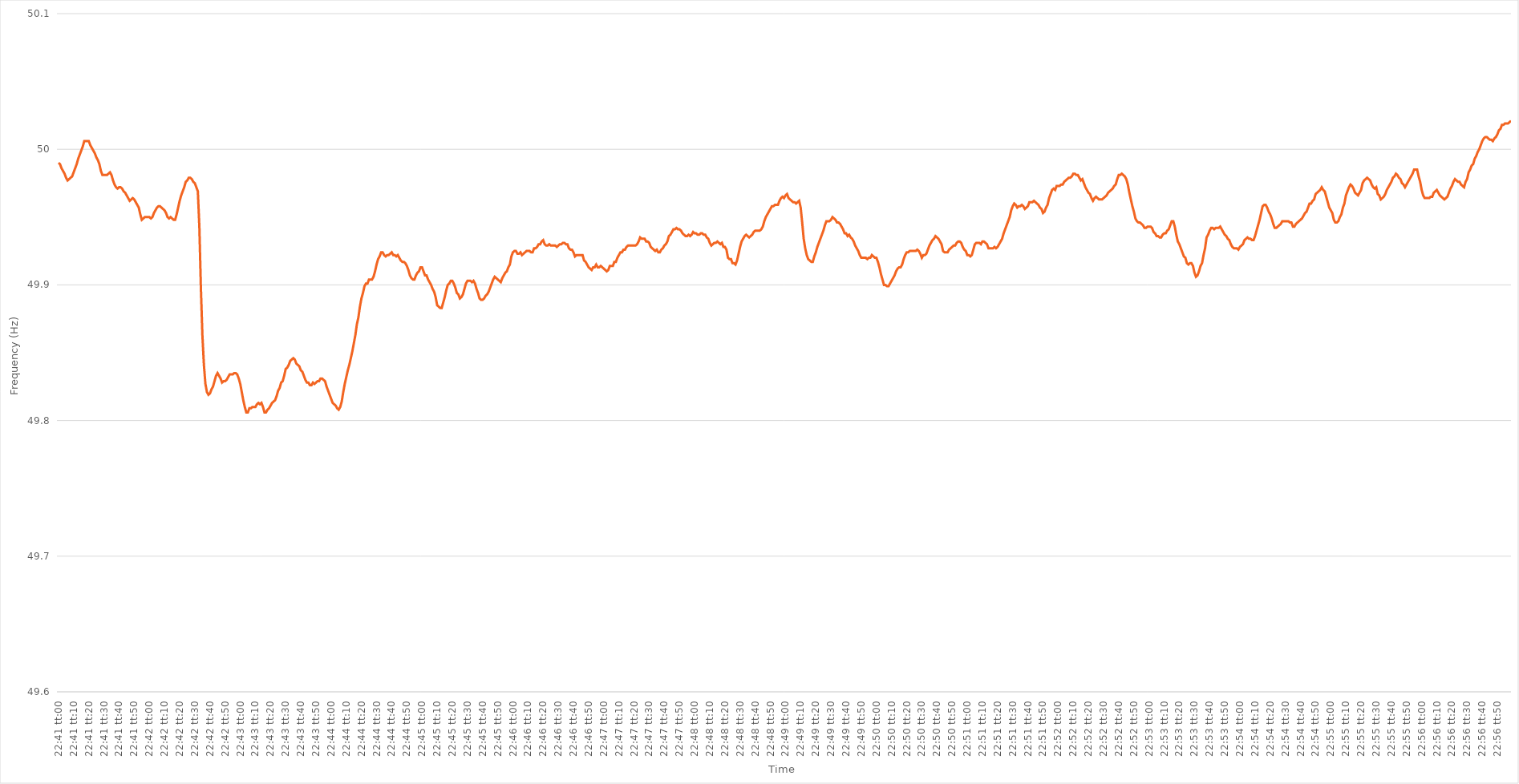
| Category | Series 0 |
|---|---|
| 0.9451388888888889 | 49.99 |
| 0.945150462962963 | 49.989 |
| 0.9451620370370369 | 49.986 |
| 0.9451736111111111 | 49.984 |
| 0.9451851851851852 | 49.982 |
| 0.9451967592592593 | 49.979 |
| 0.9452083333333333 | 49.977 |
| 0.9452199074074074 | 49.978 |
| 0.9452314814814815 | 49.979 |
| 0.9452430555555557 | 49.98 |
| 0.9452546296296296 | 49.983 |
| 0.9452662037037037 | 49.986 |
| 0.9452777777777778 | 49.989 |
| 0.9452893518518519 | 49.993 |
| 0.9453009259259259 | 49.996 |
| 0.9453125 | 49.999 |
| 0.9453240740740741 | 50.002 |
| 0.9453356481481481 | 50.006 |
| 0.9453472222222222 | 50.006 |
| 0.9453587962962963 | 50.006 |
| 0.9453703703703704 | 50.006 |
| 0.9453819444444443 | 50.003 |
| 0.9453935185185185 | 50.001 |
| 0.9454050925925926 | 49.999 |
| 0.9454166666666667 | 49.997 |
| 0.9454282407407407 | 49.994 |
| 0.9454398148148148 | 49.992 |
| 0.9454513888888889 | 49.989 |
| 0.9454629629629631 | 49.984 |
| 0.945474537037037 | 49.981 |
| 0.9454861111111111 | 49.981 |
| 0.9454976851851852 | 49.981 |
| 0.9455092592592593 | 49.981 |
| 0.9455208333333333 | 49.982 |
| 0.9455324074074074 | 49.983 |
| 0.9455439814814816 | 49.981 |
| 0.9455555555555556 | 49.977 |
| 0.9455671296296296 | 49.974 |
| 0.9455787037037037 | 49.972 |
| 0.9455902777777778 | 49.971 |
| 0.9456018518518517 | 49.972 |
| 0.9456134259259259 | 49.972 |
| 0.945625 | 49.971 |
| 0.9456365740740741 | 49.969 |
| 0.9456481481481481 | 49.968 |
| 0.9456597222222222 | 49.966 |
| 0.9456712962962963 | 49.964 |
| 0.9456828703703705 | 49.962 |
| 0.9456944444444444 | 49.963 |
| 0.9457060185185185 | 49.964 |
| 0.9457175925925926 | 49.963 |
| 0.9457291666666667 | 49.961 |
| 0.9457407407407407 | 49.959 |
| 0.9457523148148148 | 49.957 |
| 0.945763888888889 | 49.952 |
| 0.945775462962963 | 49.948 |
| 0.945787037037037 | 49.949 |
| 0.9457986111111111 | 49.95 |
| 0.9458101851851852 | 49.95 |
| 0.9458217592592592 | 49.95 |
| 0.9458333333333333 | 49.95 |
| 0.9458449074074075 | 49.949 |
| 0.9458564814814815 | 49.95 |
| 0.9458680555555555 | 49.953 |
| 0.9458796296296296 | 49.955 |
| 0.9458912037037037 | 49.957 |
| 0.9459027777777779 | 49.958 |
| 0.9459143518518518 | 49.958 |
| 0.945925925925926 | 49.957 |
| 0.9459375 | 49.956 |
| 0.9459490740740741 | 49.955 |
| 0.9459606481481481 | 49.953 |
| 0.9459722222222222 | 49.95 |
| 0.9459837962962964 | 49.949 |
| 0.9459953703703704 | 49.95 |
| 0.9460069444444444 | 49.949 |
| 0.9460185185185185 | 49.948 |
| 0.9460300925925926 | 49.948 |
| 0.9460416666666666 | 49.952 |
| 0.9460532407407407 | 49.957 |
| 0.9460648148148149 | 49.962 |
| 0.9460763888888889 | 49.966 |
| 0.9460879629629629 | 49.969 |
| 0.946099537037037 | 49.972 |
| 0.9461111111111111 | 49.976 |
| 0.9461226851851853 | 49.977 |
| 0.9461342592592592 | 49.979 |
| 0.9461458333333334 | 49.979 |
| 0.9461574074074074 | 49.978 |
| 0.9461689814814815 | 49.976 |
| 0.9461805555555555 | 49.975 |
| 0.9461921296296296 | 49.972 |
| 0.9462037037037038 | 49.969 |
| 0.9462152777777778 | 49.943 |
| 0.9462268518518518 | 49.898 |
| 0.9462384259259259 | 49.863 |
| 0.94625 | 49.841 |
| 0.946261574074074 | 49.827 |
| 0.9462731481481481 | 49.821 |
| 0.9462847222222223 | 49.819 |
| 0.9462962962962963 | 49.82 |
| 0.9463078703703703 | 49.823 |
| 0.9463194444444444 | 49.825 |
| 0.9463310185185185 | 49.829 |
| 0.9463425925925927 | 49.833 |
| 0.9463541666666666 | 49.835 |
| 0.9463657407407408 | 49.833 |
| 0.9463773148148148 | 49.831 |
| 0.946388888888889 | 49.828 |
| 0.9464004629629629 | 49.829 |
| 0.946412037037037 | 49.829 |
| 0.9464236111111112 | 49.83 |
| 0.9464351851851852 | 49.832 |
| 0.9464467592592593 | 49.834 |
| 0.9464583333333333 | 49.834 |
| 0.9464699074074074 | 49.834 |
| 0.9464814814814814 | 49.835 |
| 0.9464930555555555 | 49.835 |
| 0.9465046296296297 | 49.834 |
| 0.9465162037037037 | 49.831 |
| 0.9465277777777777 | 49.827 |
| 0.9465393518518518 | 49.821 |
| 0.9465509259259259 | 49.815 |
| 0.9465625000000001 | 49.81 |
| 0.946574074074074 | 49.806 |
| 0.9465856481481482 | 49.806 |
| 0.9465972222222222 | 49.809 |
| 0.9466087962962964 | 49.809 |
| 0.9466203703703703 | 49.81 |
| 0.9466319444444444 | 49.81 |
| 0.9466435185185186 | 49.81 |
| 0.9466550925925926 | 49.812 |
| 0.9466666666666667 | 49.813 |
| 0.9466782407407407 | 49.812 |
| 0.9466898148148148 | 49.813 |
| 0.946701388888889 | 49.81 |
| 0.9467129629629629 | 49.806 |
| 0.9467245370370371 | 49.806 |
| 0.9467361111111111 | 49.808 |
| 0.9467476851851853 | 49.809 |
| 0.9467592592592592 | 49.811 |
| 0.9467708333333333 | 49.813 |
| 0.9467824074074075 | 49.814 |
| 0.9467939814814814 | 49.815 |
| 0.9468055555555556 | 49.818 |
| 0.9468171296296296 | 49.822 |
| 0.9468287037037038 | 49.824 |
| 0.9468402777777777 | 49.828 |
| 0.9468518518518518 | 49.829 |
| 0.946863425925926 | 49.833 |
| 0.946875 | 49.838 |
| 0.9468865740740741 | 49.839 |
| 0.9468981481481481 | 49.841 |
| 0.9469097222222222 | 49.844 |
| 0.9469212962962964 | 49.845 |
| 0.9469328703703703 | 49.846 |
| 0.9469444444444445 | 49.845 |
| 0.9469560185185185 | 49.842 |
| 0.9469675925925927 | 49.841 |
| 0.9469791666666666 | 49.84 |
| 0.9469907407407407 | 49.837 |
| 0.9470023148148149 | 49.836 |
| 0.9470138888888888 | 49.833 |
| 0.947025462962963 | 49.83 |
| 0.947037037037037 | 49.828 |
| 0.9470486111111112 | 49.828 |
| 0.9470601851851851 | 49.826 |
| 0.9470717592592592 | 49.826 |
| 0.9470833333333334 | 49.828 |
| 0.9470949074074074 | 49.827 |
| 0.9471064814814815 | 49.828 |
| 0.9471180555555555 | 49.829 |
| 0.9471296296296297 | 49.829 |
| 0.9471412037037038 | 49.831 |
| 0.9471527777777777 | 49.831 |
| 0.9471643518518519 | 49.83 |
| 0.9471759259259259 | 49.829 |
| 0.9471875000000001 | 49.825 |
| 0.947199074074074 | 49.822 |
| 0.9472106481481481 | 49.819 |
| 0.9472222222222223 | 49.816 |
| 0.9472337962962962 | 49.813 |
| 0.9472453703703704 | 49.812 |
| 0.9472569444444444 | 49.811 |
| 0.9472685185185186 | 49.809 |
| 0.9472800925925925 | 49.808 |
| 0.9472916666666666 | 49.81 |
| 0.9473032407407408 | 49.814 |
| 0.9473148148148148 | 49.821 |
| 0.9473263888888889 | 49.827 |
| 0.9473379629629629 | 49.832 |
| 0.9473495370370371 | 49.837 |
| 0.9473611111111112 | 49.841 |
| 0.9473726851851851 | 49.846 |
| 0.9473842592592593 | 49.851 |
| 0.9473958333333333 | 49.857 |
| 0.9474074074074075 | 49.863 |
| 0.9474189814814814 | 49.871 |
| 0.9474305555555556 | 49.876 |
| 0.9474421296296297 | 49.884 |
| 0.9474537037037036 | 49.89 |
| 0.9474652777777778 | 49.894 |
| 0.9474768518518518 | 49.899 |
| 0.947488425925926 | 49.901 |
| 0.9474999999999999 | 49.901 |
| 0.947511574074074 | 49.904 |
| 0.9475231481481482 | 49.904 |
| 0.9475347222222222 | 49.904 |
| 0.9475462962962963 | 49.906 |
| 0.9475578703703703 | 49.91 |
| 0.9475694444444445 | 49.915 |
| 0.9475810185185186 | 49.919 |
| 0.9475925925925925 | 49.921 |
| 0.9476041666666667 | 49.924 |
| 0.9476157407407407 | 49.924 |
| 0.9476273148148149 | 49.922 |
| 0.9476388888888888 | 49.921 |
| 0.947650462962963 | 49.922 |
| 0.9476620370370371 | 49.922 |
| 0.947673611111111 | 49.923 |
| 0.9476851851851852 | 49.924 |
| 0.9476967592592592 | 49.922 |
| 0.9477083333333334 | 49.922 |
| 0.9477199074074073 | 49.921 |
| 0.9477314814814815 | 49.922 |
| 0.9477430555555556 | 49.92 |
| 0.9477546296296296 | 49.918 |
| 0.9477662037037037 | 49.917 |
| 0.9477777777777777 | 49.917 |
| 0.9477893518518519 | 49.916 |
| 0.947800925925926 | 49.914 |
| 0.9478125 | 49.911 |
| 0.9478240740740741 | 49.907 |
| 0.9478356481481481 | 49.905 |
| 0.9478472222222223 | 49.904 |
| 0.9478587962962962 | 49.904 |
| 0.9478703703703704 | 49.907 |
| 0.9478819444444445 | 49.909 |
| 0.9478935185185186 | 49.91 |
| 0.9479050925925926 | 49.913 |
| 0.9479166666666666 | 49.913 |
| 0.9479282407407408 | 49.91 |
| 0.9479398148148147 | 49.907 |
| 0.9479513888888889 | 49.907 |
| 0.947962962962963 | 49.904 |
| 0.947974537037037 | 49.902 |
| 0.9479861111111111 | 49.9 |
| 0.9479976851851851 | 49.897 |
| 0.9480092592592593 | 49.895 |
| 0.9480208333333334 | 49.891 |
| 0.9480324074074074 | 49.885 |
| 0.9480439814814815 | 49.884 |
| 0.9480555555555555 | 49.883 |
| 0.9480671296296297 | 49.883 |
| 0.9480787037037036 | 49.887 |
| 0.9480902777777778 | 49.891 |
| 0.9481018518518519 | 49.896 |
| 0.948113425925926 | 49.9 |
| 0.948125 | 49.901 |
| 0.948136574074074 | 49.903 |
| 0.9481481481481482 | 49.903 |
| 0.9481597222222223 | 49.901 |
| 0.9481712962962963 | 49.898 |
| 0.9481828703703704 | 49.894 |
| 0.9481944444444445 | 49.893 |
| 0.9482060185185185 | 49.89 |
| 0.9482175925925925 | 49.891 |
| 0.9482291666666667 | 49.893 |
| 0.9482407407407408 | 49.897 |
| 0.9482523148148148 | 49.901 |
| 0.9482638888888889 | 49.903 |
| 0.948275462962963 | 49.903 |
| 0.9482870370370371 | 49.903 |
| 0.948298611111111 | 49.902 |
| 0.9483101851851852 | 49.903 |
| 0.9483217592592593 | 49.901 |
| 0.9483333333333334 | 49.897 |
| 0.9483449074074074 | 49.894 |
| 0.9483564814814814 | 49.89 |
| 0.9483680555555556 | 49.889 |
| 0.9483796296296297 | 49.889 |
| 0.9483912037037037 | 49.89 |
| 0.9484027777777778 | 49.892 |
| 0.9484143518518519 | 49.893 |
| 0.9484259259259259 | 49.895 |
| 0.9484374999999999 | 49.898 |
| 0.9484490740740741 | 49.901 |
| 0.9484606481481482 | 49.904 |
| 0.9484722222222222 | 49.906 |
| 0.9484837962962963 | 49.905 |
| 0.9484953703703703 | 49.904 |
| 0.9485069444444445 | 49.903 |
| 0.9485185185185184 | 49.902 |
| 0.9485300925925926 | 49.905 |
| 0.9485416666666667 | 49.907 |
| 0.9485532407407408 | 49.909 |
| 0.9485648148148148 | 49.91 |
| 0.9485763888888888 | 49.913 |
| 0.948587962962963 | 49.915 |
| 0.9485995370370371 | 49.921 |
| 0.9486111111111111 | 49.924 |
| 0.9486226851851852 | 49.925 |
| 0.9486342592592593 | 49.925 |
| 0.9486458333333333 | 49.923 |
| 0.9486574074074073 | 49.923 |
| 0.9486689814814815 | 49.924 |
| 0.9486805555555556 | 49.922 |
| 0.9486921296296296 | 49.923 |
| 0.9487037037037037 | 49.924 |
| 0.9487152777777778 | 49.925 |
| 0.9487268518518519 | 49.925 |
| 0.9487384259259258 | 49.925 |
| 0.94875 | 49.924 |
| 0.9487615740740741 | 49.924 |
| 0.9487731481481482 | 49.927 |
| 0.9487847222222222 | 49.927 |
| 0.9487962962962962 | 49.928 |
| 0.9488078703703704 | 49.93 |
| 0.9488194444444445 | 49.93 |
| 0.9488310185185185 | 49.932 |
| 0.9488425925925926 | 49.933 |
| 0.9488541666666667 | 49.93 |
| 0.9488657407407407 | 49.929 |
| 0.9488773148148147 | 49.929 |
| 0.9488888888888889 | 49.93 |
| 0.948900462962963 | 49.929 |
| 0.948912037037037 | 49.929 |
| 0.9489236111111111 | 49.929 |
| 0.9489351851851852 | 49.929 |
| 0.9489467592592593 | 49.928 |
| 0.9489583333333332 | 49.929 |
| 0.9489699074074074 | 49.93 |
| 0.9489814814814815 | 49.93 |
| 0.9489930555555556 | 49.931 |
| 0.9490046296296296 | 49.931 |
| 0.9490162037037037 | 49.93 |
| 0.9490277777777778 | 49.93 |
| 0.949039351851852 | 49.927 |
| 0.9490509259259259 | 49.926 |
| 0.9490625 | 49.926 |
| 0.9490740740740741 | 49.924 |
| 0.9490856481481481 | 49.921 |
| 0.9490972222222221 | 49.922 |
| 0.9491087962962963 | 49.922 |
| 0.9491203703703704 | 49.922 |
| 0.9491319444444444 | 49.922 |
| 0.9491435185185185 | 49.922 |
| 0.9491550925925926 | 49.918 |
| 0.9491666666666667 | 49.917 |
| 0.9491782407407406 | 49.915 |
| 0.9491898148148148 | 49.913 |
| 0.9492013888888889 | 49.912 |
| 0.949212962962963 | 49.911 |
| 0.949224537037037 | 49.913 |
| 0.9492361111111111 | 49.913 |
| 0.9492476851851852 | 49.915 |
| 0.9492592592592594 | 49.913 |
| 0.9492708333333333 | 49.913 |
| 0.9492824074074074 | 49.914 |
| 0.9492939814814815 | 49.913 |
| 0.9493055555555556 | 49.912 |
| 0.9493171296296296 | 49.911 |
| 0.9493287037037037 | 49.91 |
| 0.9493402777777779 | 49.911 |
| 0.9493518518518519 | 49.914 |
| 0.9493634259259259 | 49.914 |
| 0.949375 | 49.914 |
| 0.9493865740740741 | 49.917 |
| 0.949398148148148 | 49.917 |
| 0.9494097222222222 | 49.92 |
| 0.9494212962962963 | 49.922 |
| 0.9494328703703704 | 49.924 |
| 0.9494444444444444 | 49.924 |
| 0.9494560185185185 | 49.926 |
| 0.9494675925925926 | 49.926 |
| 0.9494791666666668 | 49.928 |
| 0.9494907407407407 | 49.929 |
| 0.9495023148148148 | 49.929 |
| 0.9495138888888889 | 49.929 |
| 0.949525462962963 | 49.929 |
| 0.949537037037037 | 49.929 |
| 0.9495486111111111 | 49.929 |
| 0.9495601851851853 | 49.93 |
| 0.9495717592592593 | 49.932 |
| 0.9495833333333333 | 49.935 |
| 0.9495949074074074 | 49.934 |
| 0.9496064814814815 | 49.934 |
| 0.9496180555555555 | 49.934 |
| 0.9496296296296296 | 49.932 |
| 0.9496412037037038 | 49.932 |
| 0.9496527777777778 | 49.931 |
| 0.9496643518518518 | 49.928 |
| 0.9496759259259259 | 49.927 |
| 0.9496875 | 49.926 |
| 0.9496990740740742 | 49.925 |
| 0.9497106481481481 | 49.926 |
| 0.9497222222222222 | 49.924 |
| 0.9497337962962963 | 49.924 |
| 0.9497453703703704 | 49.926 |
| 0.9497569444444444 | 49.927 |
| 0.9497685185185185 | 49.929 |
| 0.9497800925925927 | 49.93 |
| 0.9497916666666667 | 49.932 |
| 0.9498032407407407 | 49.936 |
| 0.9498148148148148 | 49.937 |
| 0.9498263888888889 | 49.939 |
| 0.9498379629629629 | 49.941 |
| 0.949849537037037 | 49.941 |
| 0.9498611111111112 | 49.942 |
| 0.9498726851851852 | 49.941 |
| 0.9498842592592592 | 49.941 |
| 0.9498958333333333 | 49.94 |
| 0.9499074074074074 | 49.938 |
| 0.9499189814814816 | 49.937 |
| 0.9499305555555555 | 49.936 |
| 0.9499421296296297 | 49.936 |
| 0.9499537037037037 | 49.937 |
| 0.9499652777777778 | 49.936 |
| 0.9499768518518518 | 49.937 |
| 0.9499884259259259 | 49.939 |
| 0.9500000000000001 | 49.938 |
| 0.9500115740740741 | 49.938 |
| 0.9500231481481481 | 49.937 |
| 0.9500347222222222 | 49.937 |
| 0.9500462962962963 | 49.938 |
| 0.9500578703703703 | 49.938 |
| 0.9500694444444444 | 49.937 |
| 0.9500810185185186 | 49.937 |
| 0.9500925925925926 | 49.935 |
| 0.9501041666666666 | 49.934 |
| 0.9501157407407407 | 49.931 |
| 0.9501273148148148 | 49.929 |
| 0.950138888888889 | 49.93 |
| 0.9501504629629629 | 49.931 |
| 0.950162037037037 | 49.931 |
| 0.9501736111111111 | 49.932 |
| 0.9501851851851852 | 49.931 |
| 0.9501967592592592 | 49.93 |
| 0.9502083333333333 | 49.931 |
| 0.9502199074074075 | 49.928 |
| 0.9502314814814815 | 49.928 |
| 0.9502430555555555 | 49.926 |
| 0.9502546296296296 | 49.92 |
| 0.9502662037037037 | 49.919 |
| 0.9502777777777777 | 49.919 |
| 0.9502893518518518 | 49.916 |
| 0.950300925925926 | 49.916 |
| 0.9503125 | 49.915 |
| 0.950324074074074 | 49.918 |
| 0.9503356481481481 | 49.923 |
| 0.9503472222222222 | 49.928 |
| 0.9503587962962964 | 49.932 |
| 0.9503703703703703 | 49.934 |
| 0.9503819444444445 | 49.936 |
| 0.9503935185185185 | 49.937 |
| 0.9504050925925926 | 49.936 |
| 0.9504166666666666 | 49.935 |
| 0.9504282407407407 | 49.936 |
| 0.9504398148148149 | 49.937 |
| 0.9504513888888889 | 49.939 |
| 0.950462962962963 | 49.94 |
| 0.950474537037037 | 49.94 |
| 0.9504861111111111 | 49.94 |
| 0.9504976851851853 | 49.94 |
| 0.9505092592592592 | 49.941 |
| 0.9505208333333334 | 49.943 |
| 0.9505324074074074 | 49.947 |
| 0.9505439814814814 | 49.95 |
| 0.9505555555555555 | 49.952 |
| 0.9505671296296296 | 49.954 |
| 0.9505787037037038 | 49.956 |
| 0.9505902777777777 | 49.958 |
| 0.9506018518518519 | 49.958 |
| 0.9506134259259259 | 49.959 |
| 0.950625 | 49.959 |
| 0.950636574074074 | 49.959 |
| 0.9506481481481481 | 49.962 |
| 0.9506597222222223 | 49.964 |
| 0.9506712962962963 | 49.965 |
| 0.9506828703703704 | 49.964 |
| 0.9506944444444444 | 49.966 |
| 0.9507060185185185 | 49.967 |
| 0.9507175925925927 | 49.964 |
| 0.9507291666666666 | 49.963 |
| 0.9507407407407408 | 49.962 |
| 0.9507523148148148 | 49.961 |
| 0.950763888888889 | 49.961 |
| 0.9507754629629629 | 49.96 |
| 0.950787037037037 | 49.961 |
| 0.9507986111111112 | 49.962 |
| 0.9508101851851851 | 49.957 |
| 0.9508217592592593 | 49.946 |
| 0.9508333333333333 | 49.934 |
| 0.9508449074074075 | 49.927 |
| 0.9508564814814814 | 49.922 |
| 0.9508680555555555 | 49.919 |
| 0.9508796296296297 | 49.918 |
| 0.9508912037037037 | 49.917 |
| 0.9509027777777778 | 49.917 |
| 0.9509143518518518 | 49.921 |
| 0.950925925925926 | 49.924 |
| 0.9509375000000001 | 49.928 |
| 0.950949074074074 | 49.931 |
| 0.9509606481481482 | 49.934 |
| 0.9509722222222222 | 49.937 |
| 0.9509837962962964 | 49.94 |
| 0.9509953703703703 | 49.944 |
| 0.9510069444444444 | 49.947 |
| 0.9510185185185186 | 49.947 |
| 0.9510300925925925 | 49.947 |
| 0.9510416666666667 | 49.948 |
| 0.9510532407407407 | 49.95 |
| 0.9510648148148149 | 49.949 |
| 0.9510763888888888 | 49.948 |
| 0.9510879629629629 | 49.946 |
| 0.9510995370370371 | 49.946 |
| 0.9511111111111111 | 49.945 |
| 0.9511226851851852 | 49.943 |
| 0.9511342592592592 | 49.941 |
| 0.9511458333333334 | 49.938 |
| 0.9511574074074075 | 49.938 |
| 0.9511689814814814 | 49.936 |
| 0.9511805555555556 | 49.937 |
| 0.9511921296296296 | 49.935 |
| 0.9512037037037038 | 49.934 |
| 0.9512152777777777 | 49.932 |
| 0.9512268518518519 | 49.929 |
| 0.951238425925926 | 49.927 |
| 0.9512499999999999 | 49.925 |
| 0.9512615740740741 | 49.922 |
| 0.9512731481481481 | 49.92 |
| 0.9512847222222223 | 49.92 |
| 0.9512962962962962 | 49.92 |
| 0.9513078703703703 | 49.92 |
| 0.9513194444444445 | 49.919 |
| 0.9513310185185185 | 49.92 |
| 0.9513425925925926 | 49.92 |
| 0.9513541666666666 | 49.922 |
| 0.9513657407407408 | 49.921 |
| 0.9513773148148149 | 49.92 |
| 0.9513888888888888 | 49.92 |
| 0.951400462962963 | 49.917 |
| 0.951412037037037 | 49.913 |
| 0.9514236111111112 | 49.908 |
| 0.9514351851851851 | 49.904 |
| 0.9514467592592593 | 49.9 |
| 0.9514583333333334 | 49.9 |
| 0.9514699074074073 | 49.899 |
| 0.9514814814814815 | 49.899 |
| 0.9514930555555555 | 49.901 |
| 0.9515046296296297 | 49.903 |
| 0.9515162037037036 | 49.905 |
| 0.9515277777777778 | 49.907 |
| 0.9515393518518519 | 49.91 |
| 0.9515509259259259 | 49.912 |
| 0.9515625 | 49.913 |
| 0.951574074074074 | 49.913 |
| 0.9515856481481482 | 49.915 |
| 0.9515972222222223 | 49.919 |
| 0.9516087962962962 | 49.922 |
| 0.9516203703703704 | 49.924 |
| 0.9516319444444444 | 49.924 |
| 0.9516435185185186 | 49.925 |
| 0.9516550925925925 | 49.925 |
| 0.9516666666666667 | 49.925 |
| 0.9516782407407408 | 49.925 |
| 0.9516898148148147 | 49.925 |
| 0.9517013888888889 | 49.926 |
| 0.9517129629629629 | 49.925 |
| 0.9517245370370371 | 49.923 |
| 0.951736111111111 | 49.92 |
| 0.9517476851851852 | 49.922 |
| 0.9517592592592593 | 49.922 |
| 0.9517708333333333 | 49.923 |
| 0.9517824074074074 | 49.926 |
| 0.9517939814814814 | 49.929 |
| 0.9518055555555556 | 49.931 |
| 0.9518171296296297 | 49.933 |
| 0.9518287037037036 | 49.934 |
| 0.9518402777777778 | 49.936 |
| 0.9518518518518518 | 49.935 |
| 0.951863425925926 | 49.934 |
| 0.9518749999999999 | 49.932 |
| 0.9518865740740741 | 49.93 |
| 0.9518981481481482 | 49.925 |
| 0.9519097222222223 | 49.924 |
| 0.9519212962962963 | 49.924 |
| 0.9519328703703703 | 49.924 |
| 0.9519444444444445 | 49.926 |
| 0.9519560185185186 | 49.927 |
| 0.9519675925925926 | 49.928 |
| 0.9519791666666667 | 49.929 |
| 0.9519907407407407 | 49.929 |
| 0.9520023148148148 | 49.931 |
| 0.9520138888888888 | 49.932 |
| 0.952025462962963 | 49.932 |
| 0.9520370370370371 | 49.931 |
| 0.952048611111111 | 49.928 |
| 0.9520601851851852 | 49.926 |
| 0.9520717592592592 | 49.925 |
| 0.9520833333333334 | 49.922 |
| 0.9520949074074073 | 49.922 |
| 0.9521064814814815 | 49.921 |
| 0.9521180555555556 | 49.922 |
| 0.9521296296296297 | 49.926 |
| 0.9521412037037037 | 49.93 |
| 0.9521527777777777 | 49.931 |
| 0.9521643518518519 | 49.931 |
| 0.952175925925926 | 49.931 |
| 0.9521875 | 49.93 |
| 0.9521990740740741 | 49.932 |
| 0.9522106481481482 | 49.932 |
| 0.9522222222222222 | 49.931 |
| 0.9522337962962962 | 49.93 |
| 0.9522453703703704 | 49.927 |
| 0.9522569444444445 | 49.927 |
| 0.9522685185185185 | 49.927 |
| 0.9522800925925926 | 49.927 |
| 0.9522916666666666 | 49.928 |
| 0.9523032407407408 | 49.927 |
| 0.9523148148148147 | 49.928 |
| 0.9523263888888889 | 49.93 |
| 0.952337962962963 | 49.932 |
| 0.9523495370370371 | 49.934 |
| 0.9523611111111111 | 49.938 |
| 0.9523726851851851 | 49.941 |
| 0.9523842592592593 | 49.944 |
| 0.9523958333333334 | 49.947 |
| 0.9524074074074074 | 49.95 |
| 0.9524189814814815 | 49.955 |
| 0.9524305555555556 | 49.958 |
| 0.9524421296296296 | 49.96 |
| 0.9524537037037036 | 49.959 |
| 0.9524652777777778 | 49.957 |
| 0.9524768518518519 | 49.958 |
| 0.9524884259259259 | 49.958 |
| 0.9525 | 49.959 |
| 0.952511574074074 | 49.958 |
| 0.9525231481481482 | 49.956 |
| 0.9525347222222221 | 49.957 |
| 0.9525462962962963 | 49.958 |
| 0.9525578703703704 | 49.961 |
| 0.9525694444444445 | 49.961 |
| 0.9525810185185185 | 49.961 |
| 0.9525925925925925 | 49.962 |
| 0.9526041666666667 | 49.961 |
| 0.9526157407407408 | 49.96 |
| 0.9526273148148148 | 49.959 |
| 0.9526388888888889 | 49.957 |
| 0.952650462962963 | 49.956 |
| 0.952662037037037 | 49.953 |
| 0.952673611111111 | 49.954 |
| 0.9526851851851852 | 49.957 |
| 0.9526967592592593 | 49.959 |
| 0.9527083333333333 | 49.964 |
| 0.9527199074074074 | 49.967 |
| 0.9527314814814815 | 49.97 |
| 0.9527430555555556 | 49.971 |
| 0.9527546296296295 | 49.97 |
| 0.9527662037037037 | 49.973 |
| 0.9527777777777778 | 49.973 |
| 0.9527893518518519 | 49.973 |
| 0.9528009259259259 | 49.974 |
| 0.9528125 | 49.974 |
| 0.9528240740740741 | 49.976 |
| 0.9528356481481483 | 49.977 |
| 0.9528472222222222 | 49.978 |
| 0.9528587962962963 | 49.979 |
| 0.9528703703703704 | 49.979 |
| 0.9528819444444444 | 49.98 |
| 0.9528935185185184 | 49.982 |
| 0.9529050925925926 | 49.982 |
| 0.9529166666666667 | 49.981 |
| 0.9529282407407407 | 49.981 |
| 0.9529398148148148 | 49.979 |
| 0.9529513888888889 | 49.977 |
| 0.952962962962963 | 49.978 |
| 0.9529745370370369 | 49.975 |
| 0.9529861111111111 | 49.972 |
| 0.9529976851851852 | 49.97 |
| 0.9530092592592593 | 49.968 |
| 0.9530208333333333 | 49.967 |
| 0.9530324074074074 | 49.964 |
| 0.9530439814814815 | 49.962 |
| 0.9530555555555557 | 49.964 |
| 0.9530671296296296 | 49.965 |
| 0.9530787037037037 | 49.964 |
| 0.9530902777777778 | 49.963 |
| 0.9531018518518519 | 49.963 |
| 0.9531134259259259 | 49.963 |
| 0.953125 | 49.964 |
| 0.9531365740740741 | 49.965 |
| 0.9531481481481481 | 49.966 |
| 0.9531597222222222 | 49.968 |
| 0.9531712962962963 | 49.969 |
| 0.9531828703703704 | 49.97 |
| 0.9531944444444443 | 49.971 |
| 0.9532060185185185 | 49.973 |
| 0.9532175925925926 | 49.974 |
| 0.9532291666666667 | 49.978 |
| 0.9532407407407407 | 49.981 |
| 0.9532523148148148 | 49.981 |
| 0.9532638888888889 | 49.982 |
| 0.9532754629629631 | 49.981 |
| 0.953287037037037 | 49.98 |
| 0.9532986111111111 | 49.978 |
| 0.9533101851851852 | 49.974 |
| 0.9533217592592593 | 49.968 |
| 0.9533333333333333 | 49.963 |
| 0.9533449074074074 | 49.958 |
| 0.9533564814814816 | 49.954 |
| 0.9533680555555556 | 49.949 |
| 0.9533796296296296 | 49.947 |
| 0.9533912037037037 | 49.946 |
| 0.9534027777777778 | 49.946 |
| 0.9534143518518517 | 49.945 |
| 0.9534259259259259 | 49.944 |
| 0.9534375 | 49.942 |
| 0.9534490740740741 | 49.942 |
| 0.9534606481481481 | 49.943 |
| 0.9534722222222222 | 49.943 |
| 0.9534837962962963 | 49.943 |
| 0.9534953703703705 | 49.942 |
| 0.9535069444444444 | 49.939 |
| 0.9535185185185185 | 49.938 |
| 0.9535300925925926 | 49.936 |
| 0.9535416666666667 | 49.936 |
| 0.9535532407407407 | 49.935 |
| 0.9535648148148148 | 49.935 |
| 0.953576388888889 | 49.937 |
| 0.953587962962963 | 49.938 |
| 0.953599537037037 | 49.938 |
| 0.9536111111111111 | 49.94 |
| 0.9536226851851852 | 49.941 |
| 0.9536342592592592 | 49.944 |
| 0.9536458333333333 | 49.947 |
| 0.9536574074074075 | 49.947 |
| 0.9536689814814815 | 49.943 |
| 0.9536805555555555 | 49.937 |
| 0.9536921296296296 | 49.932 |
| 0.9537037037037037 | 49.93 |
| 0.9537152777777779 | 49.927 |
| 0.9537268518518518 | 49.924 |
| 0.953738425925926 | 49.921 |
| 0.95375 | 49.92 |
| 0.9537615740740741 | 49.916 |
| 0.9537731481481481 | 49.915 |
| 0.9537847222222222 | 49.916 |
| 0.9537962962962964 | 49.916 |
| 0.9538078703703704 | 49.914 |
| 0.9538194444444444 | 49.909 |
| 0.9538310185185185 | 49.906 |
| 0.9538425925925926 | 49.907 |
| 0.9538541666666666 | 49.91 |
| 0.9538657407407407 | 49.914 |
| 0.9538773148148149 | 49.916 |
| 0.9538888888888889 | 49.922 |
| 0.9539004629629629 | 49.927 |
| 0.953912037037037 | 49.935 |
| 0.9539236111111111 | 49.937 |
| 0.9539351851851853 | 49.94 |
| 0.9539467592592592 | 49.942 |
| 0.9539583333333334 | 49.942 |
| 0.9539699074074074 | 49.941 |
| 0.9539814814814815 | 49.942 |
| 0.9539930555555555 | 49.942 |
| 0.9540046296296296 | 49.942 |
| 0.9540162037037038 | 49.943 |
| 0.9540277777777778 | 49.941 |
| 0.9540393518518518 | 49.939 |
| 0.9540509259259259 | 49.937 |
| 0.9540625 | 49.936 |
| 0.954074074074074 | 49.934 |
| 0.9540856481481481 | 49.933 |
| 0.9540972222222223 | 49.93 |
| 0.9541087962962963 | 49.928 |
| 0.9541203703703703 | 49.927 |
| 0.9541319444444444 | 49.927 |
| 0.9541435185185185 | 49.927 |
| 0.9541550925925927 | 49.926 |
| 0.9541666666666666 | 49.928 |
| 0.9541782407407408 | 49.929 |
| 0.9541898148148148 | 49.93 |
| 0.954201388888889 | 49.933 |
| 0.9542129629629629 | 49.934 |
| 0.954224537037037 | 49.935 |
| 0.9542361111111112 | 49.934 |
| 0.9542476851851852 | 49.934 |
| 0.9542592592592593 | 49.933 |
| 0.9542708333333333 | 49.933 |
| 0.9542824074074074 | 49.936 |
| 0.9542939814814814 | 49.94 |
| 0.9543055555555555 | 49.944 |
| 0.9543171296296297 | 49.948 |
| 0.9543287037037037 | 49.953 |
| 0.9543402777777777 | 49.958 |
| 0.9543518518518518 | 49.959 |
| 0.9543634259259259 | 49.959 |
| 0.9543750000000001 | 49.957 |
| 0.954386574074074 | 49.954 |
| 0.9543981481481482 | 49.952 |
| 0.9544097222222222 | 49.949 |
| 0.9544212962962964 | 49.945 |
| 0.9544328703703703 | 49.942 |
| 0.9544444444444444 | 49.942 |
| 0.9544560185185186 | 49.943 |
| 0.9544675925925926 | 49.944 |
| 0.9544791666666667 | 49.945 |
| 0.9544907407407407 | 49.947 |
| 0.9545023148148148 | 49.947 |
| 0.954513888888889 | 49.947 |
| 0.9545254629629629 | 49.947 |
| 0.9545370370370371 | 49.947 |
| 0.9545486111111111 | 49.946 |
| 0.9545601851851853 | 49.946 |
| 0.9545717592592592 | 49.943 |
| 0.9545833333333333 | 49.943 |
| 0.9545949074074075 | 49.945 |
| 0.9546064814814814 | 49.946 |
| 0.9546180555555556 | 49.947 |
| 0.9546296296296296 | 49.948 |
| 0.9546412037037038 | 49.949 |
| 0.9546527777777777 | 49.951 |
| 0.9546643518518518 | 49.953 |
| 0.954675925925926 | 49.954 |
| 0.9546875 | 49.957 |
| 0.9546990740740741 | 49.96 |
| 0.9547106481481481 | 49.96 |
| 0.9547222222222222 | 49.962 |
| 0.9547337962962964 | 49.963 |
| 0.9547453703703703 | 49.967 |
| 0.9547569444444445 | 49.968 |
| 0.9547685185185185 | 49.969 |
| 0.9547800925925927 | 49.97 |
| 0.9547916666666666 | 49.972 |
| 0.9548032407407407 | 49.97 |
| 0.9548148148148149 | 49.969 |
| 0.9548263888888888 | 49.965 |
| 0.954837962962963 | 49.961 |
| 0.954849537037037 | 49.957 |
| 0.9548611111111112 | 49.955 |
| 0.9548726851851851 | 49.953 |
| 0.9548842592592592 | 49.948 |
| 0.9548958333333334 | 49.946 |
| 0.9549074074074074 | 49.946 |
| 0.9549189814814815 | 49.947 |
| 0.9549305555555555 | 49.95 |
| 0.9549421296296297 | 49.952 |
| 0.9549537037037038 | 49.957 |
| 0.9549652777777777 | 49.96 |
| 0.9549768518518519 | 49.966 |
| 0.9549884259259259 | 49.969 |
| 0.9550000000000001 | 49.972 |
| 0.955011574074074 | 49.974 |
| 0.9550231481481481 | 49.973 |
| 0.9550347222222223 | 49.971 |
| 0.9550462962962962 | 49.968 |
| 0.9550578703703704 | 49.967 |
| 0.9550694444444444 | 49.966 |
| 0.9550810185185186 | 49.968 |
| 0.9550925925925925 | 49.97 |
| 0.9551041666666666 | 49.975 |
| 0.9551157407407408 | 49.977 |
| 0.9551273148148148 | 49.978 |
| 0.9551388888888889 | 49.979 |
| 0.9551504629629629 | 49.978 |
| 0.9551620370370371 | 49.977 |
| 0.9551736111111112 | 49.974 |
| 0.9551851851851851 | 49.972 |
| 0.9551967592592593 | 49.971 |
| 0.9552083333333333 | 49.972 |
| 0.9552199074074075 | 49.967 |
| 0.9552314814814814 | 49.966 |
| 0.9552430555555556 | 49.963 |
| 0.9552546296296297 | 49.964 |
| 0.9552662037037036 | 49.965 |
| 0.9552777777777778 | 49.967 |
| 0.9552893518518518 | 49.97 |
| 0.955300925925926 | 49.972 |
| 0.9553124999999999 | 49.974 |
| 0.955324074074074 | 49.976 |
| 0.9553356481481482 | 49.979 |
| 0.9553472222222222 | 49.98 |
| 0.9553587962962963 | 49.982 |
| 0.9553703703703703 | 49.981 |
| 0.9553819444444445 | 49.979 |
| 0.9553935185185186 | 49.978 |
| 0.9554050925925925 | 49.975 |
| 0.9554166666666667 | 49.974 |
| 0.9554282407407407 | 49.972 |
| 0.9554398148148149 | 49.974 |
| 0.9554513888888888 | 49.976 |
| 0.955462962962963 | 49.978 |
| 0.9554745370370371 | 49.98 |
| 0.955486111111111 | 49.982 |
| 0.9554976851851852 | 49.985 |
| 0.9555092592592592 | 49.985 |
| 0.9555208333333334 | 49.985 |
| 0.9555324074074073 | 49.98 |
| 0.9555439814814815 | 49.976 |
| 0.9555555555555556 | 49.97 |
| 0.9555671296296296 | 49.966 |
| 0.9555787037037037 | 49.964 |
| 0.9555902777777777 | 49.964 |
| 0.9556018518518519 | 49.964 |
| 0.955613425925926 | 49.964 |
| 0.955625 | 49.965 |
| 0.9556365740740741 | 49.965 |
| 0.9556481481481481 | 49.968 |
| 0.9556597222222223 | 49.969 |
| 0.9556712962962962 | 49.97 |
| 0.9556828703703704 | 49.968 |
| 0.9556944444444445 | 49.966 |
| 0.9557060185185186 | 49.965 |
| 0.9557175925925926 | 49.964 |
| 0.9557291666666666 | 49.963 |
| 0.9557407407407408 | 49.964 |
| 0.9557523148148147 | 49.965 |
| 0.9557638888888889 | 49.968 |
| 0.955775462962963 | 49.971 |
| 0.955787037037037 | 49.973 |
| 0.9557986111111111 | 49.976 |
| 0.9558101851851851 | 49.978 |
| 0.9558217592592593 | 49.977 |
| 0.9558333333333334 | 49.976 |
| 0.9558449074074074 | 49.976 |
| 0.9558564814814815 | 49.974 |
| 0.9558680555555555 | 49.973 |
| 0.9558796296296297 | 49.972 |
| 0.9558912037037036 | 49.976 |
| 0.9559027777777778 | 49.978 |
| 0.9559143518518519 | 49.983 |
| 0.955925925925926 | 49.985 |
| 0.9559375 | 49.988 |
| 0.955949074074074 | 49.989 |
| 0.9559606481481482 | 49.993 |
| 0.9559722222222223 | 49.995 |
| 0.9559837962962963 | 49.998 |
| 0.9559953703703704 | 50 |
| 0.9560069444444445 | 50.003 |
| 0.9560185185185185 | 50.006 |
| 0.9560300925925925 | 50.008 |
| 0.9560416666666667 | 50.009 |
| 0.9560532407407408 | 50.009 |
| 0.9560648148148148 | 50.008 |
| 0.9560763888888889 | 50.007 |
| 0.956087962962963 | 50.007 |
| 0.9560995370370371 | 50.006 |
| 0.956111111111111 | 50.008 |
| 0.9561226851851852 | 50.009 |
| 0.9561342592592593 | 50.011 |
| 0.9561458333333334 | 50.014 |
| 0.9561574074074074 | 50.015 |
| 0.9561689814814814 | 50.018 |
| 0.9561805555555556 | 50.018 |
| 0.9561921296296297 | 50.019 |
| 0.9562037037037037 | 50.019 |
| 0.9562152777777778 | 50.019 |
| 0.9562268518518519 | 50.02 |
| 0.9562384259259259 | 50.021 |